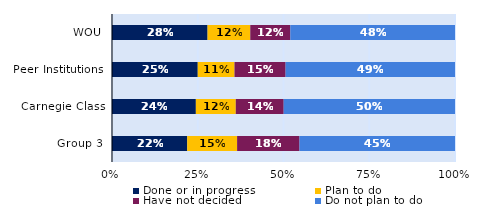
| Category | Done or in progress | Plan to do | Have not decided | Do not plan to do |
|---|---|---|---|---|
| WOU | 0.279 | 0.125 | 0.117 | 0.48 |
| Peer Institutions | 0.25 | 0.107 | 0.149 | 0.494 |
| Carnegie Class | 0.244 | 0.116 | 0.14 | 0.499 |
| Group 3 | 0.219 | 0.145 | 0.182 | 0.453 |